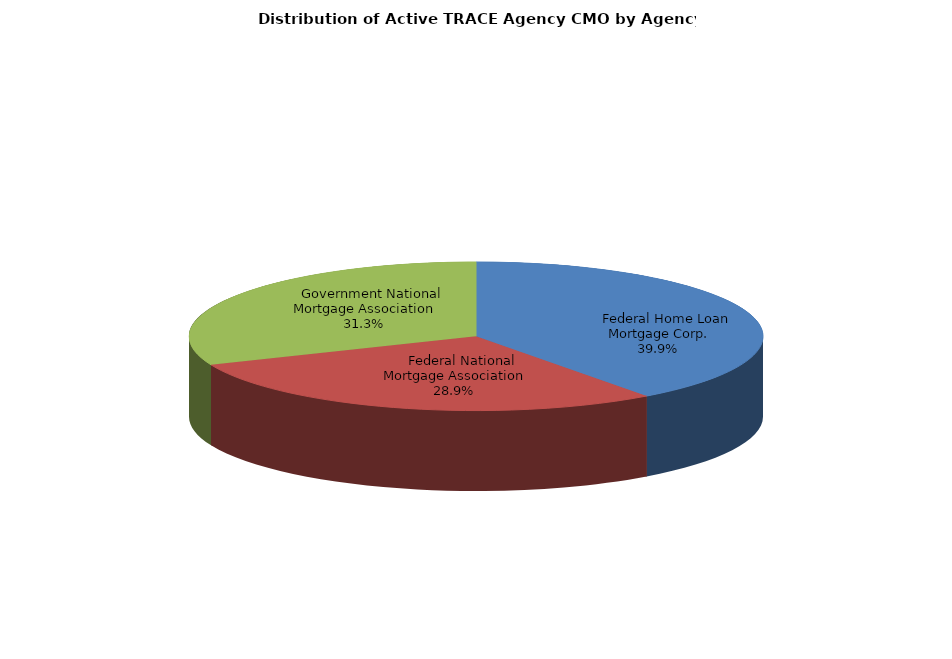
| Category | Series 0 |
|---|---|
|     Federal Home Loan Mortgage Corp. | 66900 |
|     Federal National Mortgage Association | 48413 |
|     Government National Mortgage Association | 52493 |